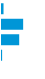
| Category | Series 0 |
|---|---|
| 0 | 0.038 |
| 1 | 0.529 |
| 2 | 0.43 |
| 3 | 0.003 |